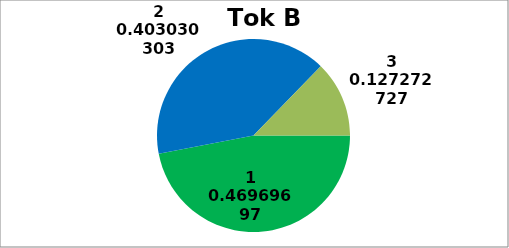
| Category | Series 0 |
|---|---|
| 0 | 155 |
| 1 | 133 |
| 2 | 42 |